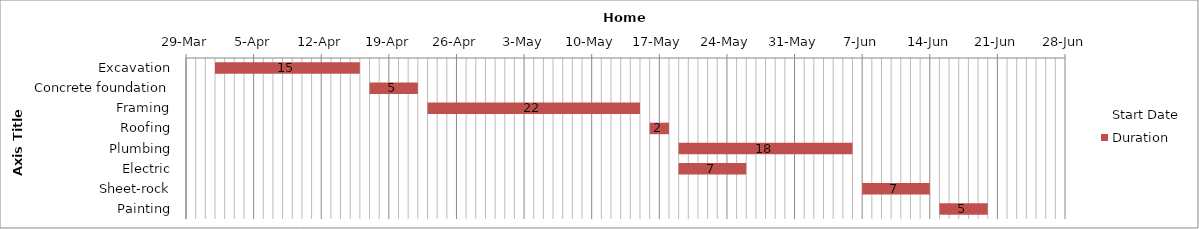
| Category | Start Date | Duration |
|---|---|---|
| Excavation | 2015-04-01 | 15 |
| Concrete foundation | 2015-04-17 | 5 |
| Framing | 2015-04-23 | 22 |
| Roofing | 2015-05-16 | 2 |
| Plumbing | 2015-05-19 | 18 |
| Electric | 2015-05-19 | 7 |
| Sheet-rock | 2015-06-07 | 7 |
| Painting | 2015-06-15 | 5 |